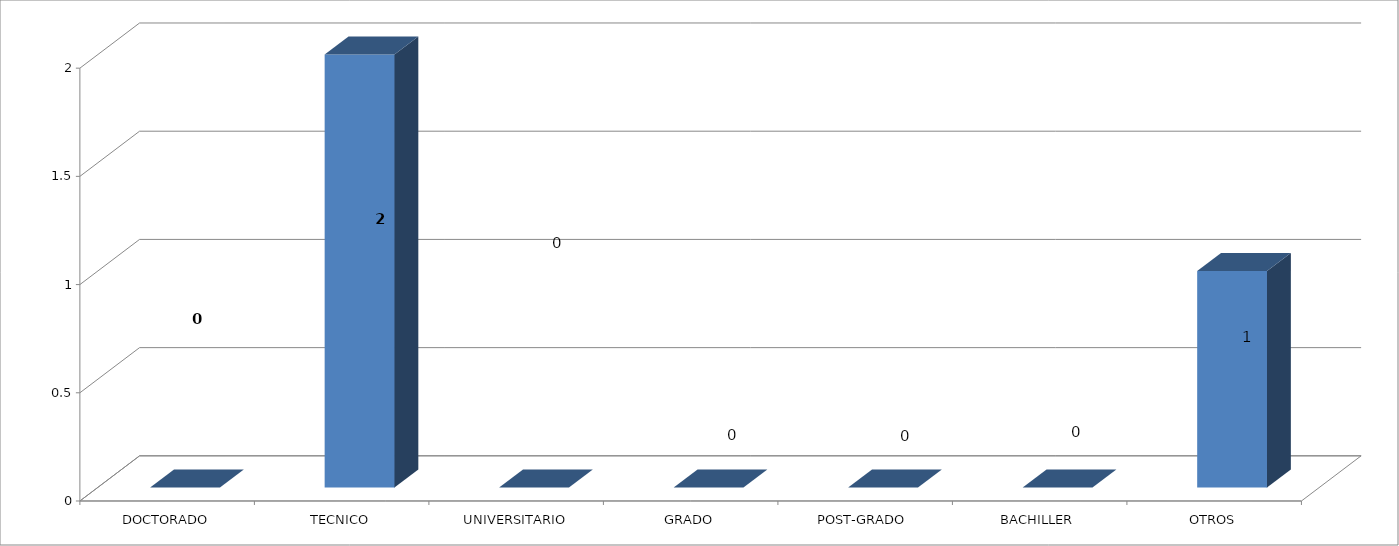
| Category | Series 0 |
|---|---|
| DOCTORADO | 0 |
| TECNICO | 2 |
| UNIVERSITARIO | 0 |
| GRADO | 0 |
| POST-GRADO  | 0 |
| BACHILLER | 0 |
| OTROS | 1 |